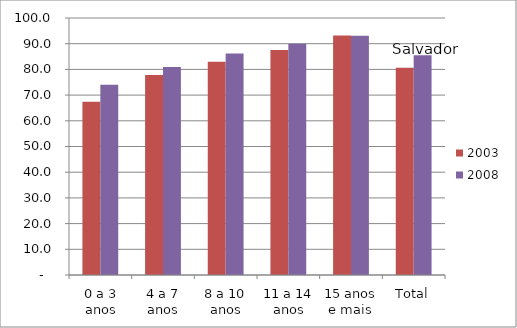
| Category | 2003 | 2008 |
|---|---|---|
| 0 a 3 anos | 67.44 | 73.99 |
| 4 a 7 anos | 77.81 | 80.98 |
| 8 a 10 anos | 82.98 | 86.2 |
| 11 a 14 anos | 87.55 | 89.99 |
| 15 anos e mais | 93.18 | 93.05 |
| Total | 80.62 | 85.46 |